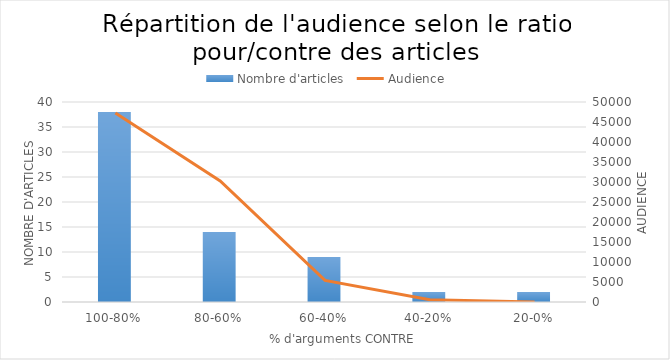
| Category | Nombre d'articles |
|---|---|
| 100-80% | 38 |
| 80-60% | 14 |
| 60-40% | 9 |
| 40-20% | 2 |
| 20-0% | 2 |